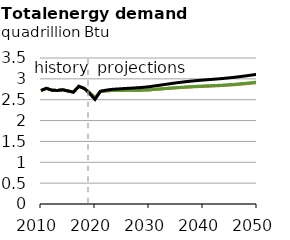
| Category | EAC | DAC | Reference |
|---|---|---|---|
| 2010.0 | 2.72 | 2.72 | 2.72 |
| 2011.0 | 2.773 | 2.773 | 2.773 |
| 2012.0 | 2.73 | 2.73 | 2.73 |
| 2013.0 | 2.721 | 2.721 | 2.721 |
| 2014.0 | 2.738 | 2.738 | 2.738 |
| 2015.0 | 2.71 | 2.71 | 2.71 |
| 2016.0 | 2.681 | 2.681 | 2.681 |
| 2017.0 | 2.822 | 2.822 | 2.822 |
| 2018.0 | 2.772 | 2.772 | 2.772 |
| 2019.0 | 2.669 | 2.669 | 2.65 |
| 2020.0 | 2.549 | 2.549 | 2.506 |
| 2021.0 | 2.697 | 2.697 | 2.702 |
| 2022.0 | 2.711 | 2.711 | 2.728 |
| 2023.0 | 2.72 | 2.719 | 2.746 |
| 2024.0 | 2.721 | 2.721 | 2.756 |
| 2025.0 | 2.723 | 2.722 | 2.764 |
| 2026.0 | 2.724 | 2.724 | 2.772 |
| 2027.0 | 2.725 | 2.725 | 2.779 |
| 2028.0 | 2.727 | 2.726 | 2.787 |
| 2029.0 | 2.731 | 2.73 | 2.798 |
| 2030.0 | 2.736 | 2.736 | 2.81 |
| 2031.0 | 2.747 | 2.746 | 2.829 |
| 2032.0 | 2.758 | 2.756 | 2.848 |
| 2033.0 | 2.767 | 2.767 | 2.867 |
| 2034.0 | 2.777 | 2.778 | 2.886 |
| 2035.0 | 2.786 | 2.788 | 2.904 |
| 2036.0 | 2.792 | 2.798 | 2.92 |
| 2037.0 | 2.8 | 2.807 | 2.935 |
| 2038.0 | 2.807 | 2.815 | 2.948 |
| 2039.0 | 2.813 | 2.822 | 2.96 |
| 2040.0 | 2.819 | 2.828 | 2.971 |
| 2041.0 | 2.824 | 2.834 | 2.981 |
| 2042.0 | 2.83 | 2.839 | 2.991 |
| 2043.0 | 2.836 | 2.845 | 3.001 |
| 2044.0 | 2.844 | 2.852 | 3.013 |
| 2045.0 | 2.852 | 2.861 | 3.026 |
| 2046.0 | 2.861 | 2.871 | 3.04 |
| 2047.0 | 2.872 | 2.883 | 3.056 |
| 2048.0 | 2.884 | 2.895 | 3.073 |
| 2049.0 | 2.896 | 2.909 | 3.091 |
| 2050.0 | 2.909 | 2.922 | 3.108 |